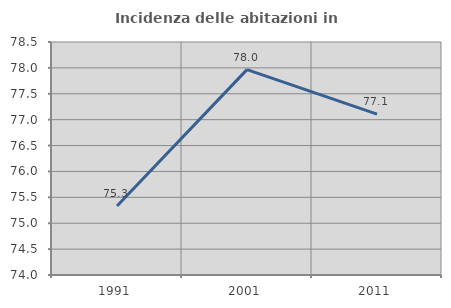
| Category | Incidenza delle abitazioni in proprietà  |
|---|---|
| 1991.0 | 75.333 |
| 2001.0 | 77.966 |
| 2011.0 | 77.108 |